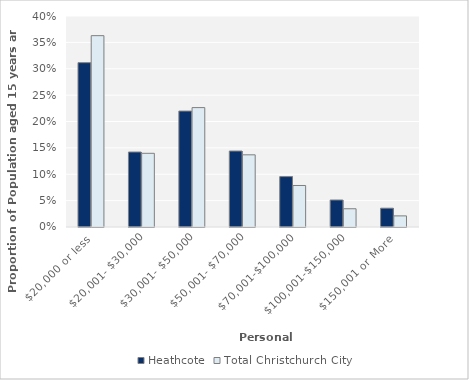
| Category | Heathcote | Total Christchurch City |
|---|---|---|
| $20,000 or less | 0.312 | 0.363 |
| $20,001- $30,000 | 0.142 | 0.14 |
| $30,001- $50,000 | 0.22 | 0.226 |
| $50,001- $70,000 | 0.144 | 0.137 |
| $70,001-$100,000 | 0.096 | 0.079 |
| $100,001-$150,000 | 0.051 | 0.035 |
| $150,001 or More | 0.036 | 0.021 |